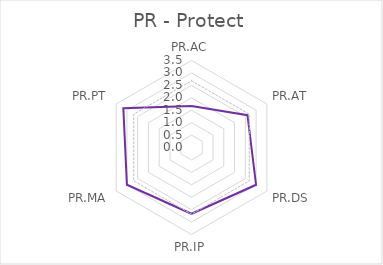
| Category | Series 0 | Series 1 |
|---|---|---|
| PR.AC | 1.667 | 2.683 |
| PR.AT | 2.6 | 2.683 |
| PR.DS | 3 | 2.683 |
| PR.IP | 2.667 | 2.683 |
| PR.MA | 3 | 2.683 |
| PR.PT | 3.167 | 2.683 |